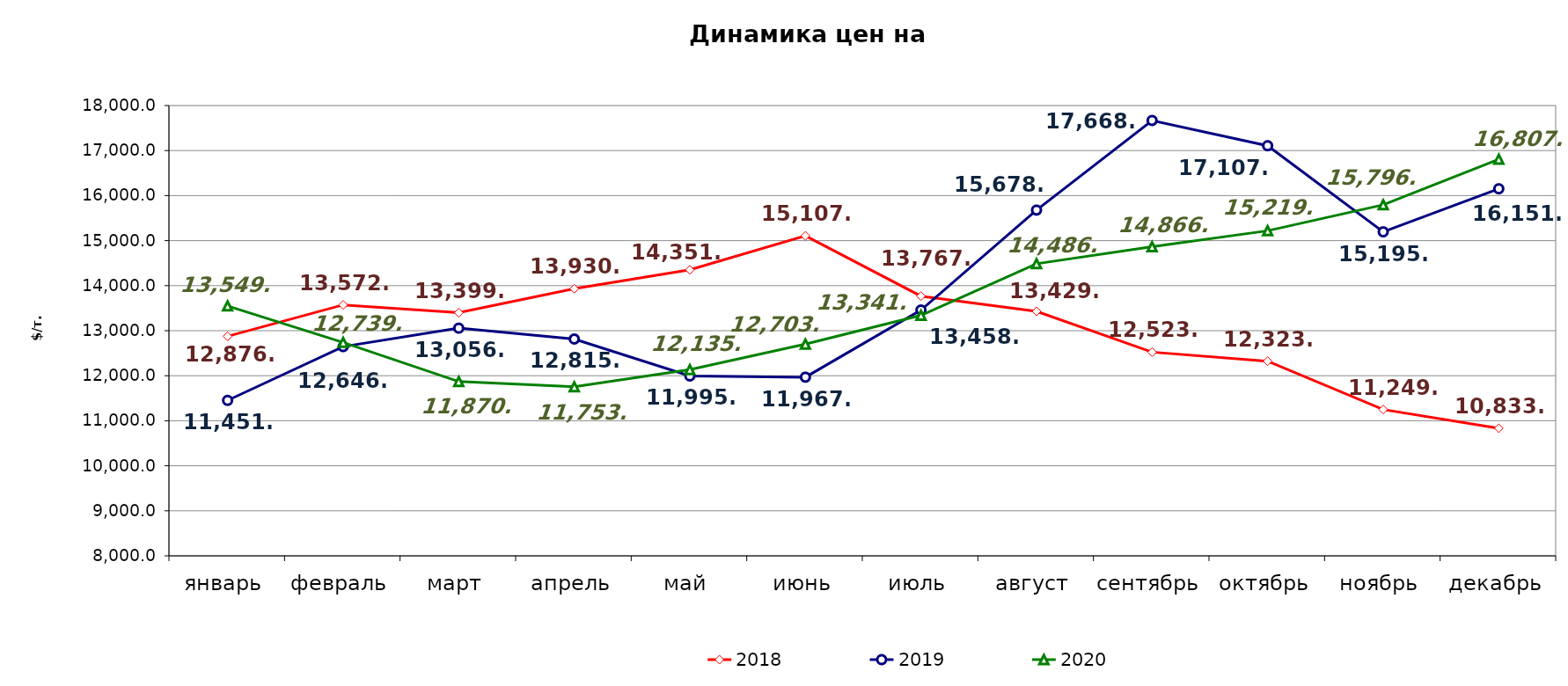
| Category | 2018 | 2019 | 2020 |
|---|---|---|---|
| январь | 12876.03 | 11451.94 | 13549.43 |
| февраль | 13572.75 | 12646.5 | 12739.5 |
| март | 13399.76 | 13056.307 | 11870.4 |
| апрель | 13930.75 | 12815.125 | 11753.2 |
| май | 14351.67 | 11995.117 | 12135.318 |
| июнь | 15107.03 | 11967.25 | 12703.27 |
| июль | 13767.73 | 13458.586 | 13341.349 |
| август | 13429.2 | 15677.976 | 14486.85 |
| сентябрь | 12523.875 | 17668.098 | 14866.271 |
| октябрь | 12323.152 | 17107.61 | 15219.362 |
| ноябрь | 11249.21 | 15195.24 | 15796.049 |
| декабрь | 10833.291 | 16151.425 | 16807.049 |